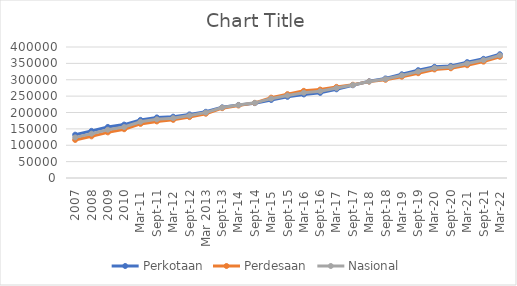
| Category | Perkotaan | Perdesaan | Nasional |
|---|---|---|---|
| 2007 | 132259 | 116265 | 123993 |
| 2008 | 143897 | 127207 | 135270 |
| 2009 | 155909 | 139331 | 147339 |
| 2010 | 163077 | 148939 | 155615 |
| Mar-11 | 177342 | 165211 | 171834 |
| Sep-11 | 184919 | 172723 | 179204 |
| Mar-12 | 187194 | 177521 | 182796 |
| Sep-12 | 194207 | 185967 | 190758 |
| Mar 2013 | 202137 | 196215 | 199691 |
| Sep-13 | 215750 | 213250 | 215122 |
| Mar-14 | 223091 | 221379 | 222628 |
| Sep-14 | 228534 | 229391 | 229469 |
| Mar-15 | 238278 | 245357 | 242241 |
| Sep-15 | 247840 | 256120 | 251943 |
| Mar-16 | 255181 | 266132 | 260469 |
| Sep-16 | 259886 | 270038 | 264941 |
| Mar-17 | 270856.32 | 278277.85 | 274544.38 |
| Sep-17 | 283220 | 284740 | 283964 |
| Mar-18 | 295272 | 294302 | 294806 |
| Sep-18 | 303909.85 | 299883.76 | 302022.07 |
| Mar-19 | 316687 | 309287 | 313232 |
| Sep-19 | 329220 | 320019 | 324911 |
| Mar-20 | 339519 | 331492 | 335793 |
| Sep-20 | 342356 | 335042 | 339003 |
| Mar-21 | 353767 | 344277 | 349474 |
| Sep-21 | 363836 | 355299 | 360007 |
| Mar-22 | 377958 | 370096 | 374455 |